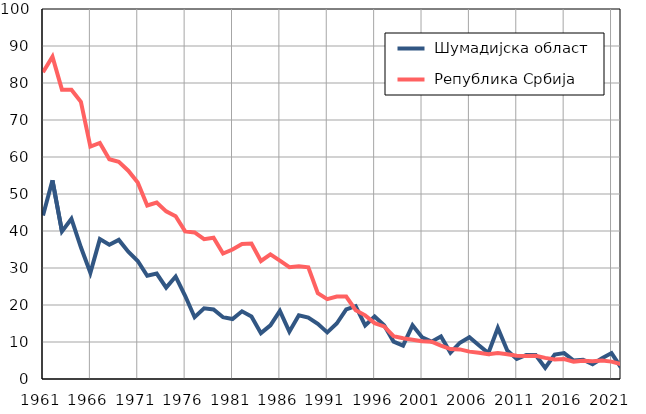
| Category |  Шумадијска област |  Република Србија |
|---|---|---|
| 1961.0 | 44.2 | 82.9 |
| 1962.0 | 53.7 | 87.1 |
| 1963.0 | 39.9 | 78.2 |
| 1964.0 | 43.3 | 78.2 |
| 1965.0 | 35.6 | 74.9 |
| 1966.0 | 28.7 | 62.8 |
| 1967.0 | 37.8 | 63.8 |
| 1968.0 | 36.3 | 59.4 |
| 1969.0 | 37.6 | 58.7 |
| 1970.0 | 34.4 | 56.3 |
| 1971.0 | 31.9 | 53.1 |
| 1972.0 | 27.9 | 46.9 |
| 1973.0 | 28.5 | 47.7 |
| 1974.0 | 24.7 | 45.3 |
| 1975.0 | 27.7 | 44 |
| 1976.0 | 22.5 | 39.9 |
| 1977.0 | 16.7 | 39.6 |
| 1978.0 | 19.1 | 37.8 |
| 1979.0 | 18.8 | 38.2 |
| 1980.0 | 16.7 | 33.9 |
| 1981.0 | 16.2 | 35 |
| 1982.0 | 18.3 | 36.5 |
| 1983.0 | 16.9 | 36.6 |
| 1984.0 | 12.4 | 31.9 |
| 1985.0 | 14.5 | 33.7 |
| 1986.0 | 18.4 | 32 |
| 1987.0 | 12.8 | 30.2 |
| 1988.0 | 17.2 | 30.5 |
| 1989.0 | 16.6 | 30.2 |
| 1990.0 | 14.9 | 23.2 |
| 1991.0 | 12.6 | 21.6 |
| 1992.0 | 15 | 22.3 |
| 1993.0 | 18.8 | 22.3 |
| 1994.0 | 19.7 | 18.6 |
| 1995.0 | 14.5 | 17.2 |
| 1996.0 | 16.9 | 15.1 |
| 1997.0 | 14.5 | 14.2 |
| 1998.0 | 10.1 | 11.6 |
| 1999.0 | 9 | 11 |
| 2000.0 | 14.5 | 10.6 |
| 2001.0 | 11.3 | 10.2 |
| 2002.0 | 10.1 | 10.1 |
| 2003.0 | 11.5 | 9 |
| 2004.0 | 7.1 | 8.1 |
| 2005.0 | 9.8 | 8 |
| 2006.0 | 11.3 | 7.4 |
| 2007.0 | 9.1 | 7.1 |
| 2008.0 | 7 | 6.7 |
| 2009.0 | 13.8 | 7 |
| 2010.0 | 7.7 | 6.7 |
| 2011.0 | 5.4 | 6.3 |
| 2012.0 | 6.5 | 6.2 |
| 2013.0 | 6.5 | 6.3 |
| 2014.0 | 3 | 5.7 |
| 2015.0 | 6.6 | 5.3 |
| 2016.0 | 7 | 5.4 |
| 2017.0 | 5 | 4.7 |
| 2018.0 | 5.2 | 4.9 |
| 2019.0 | 4 | 4.8 |
| 2020.0 | 5.6 | 5 |
| 2021.0 | 7 | 4.7 |
| 2022.0 | 3.1 | 4 |